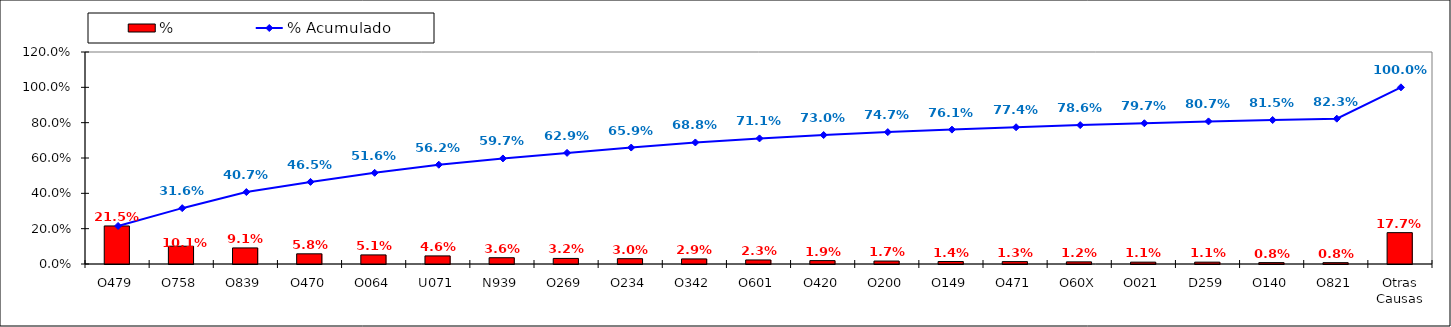
| Category | % |
|---|---|
| O479 | 0.215 |
| O758 | 0.101 |
| O839 | 0.091 |
| O470 | 0.058 |
| O064 | 0.051 |
| U071 | 0.046 |
| N939 | 0.036 |
| O269 | 0.032 |
| O234 | 0.03 |
| O342 | 0.029 |
| O601 | 0.023 |
| O420 | 0.019 |
| O200 | 0.017 |
| O149 | 0.014 |
| O471 | 0.013 |
| O60X | 0.012 |
| O021 | 0.011 |
| D259 | 0.011 |
| O140 | 0.008 |
| O821 | 0.008 |
| Otras Causas | 0.177 |